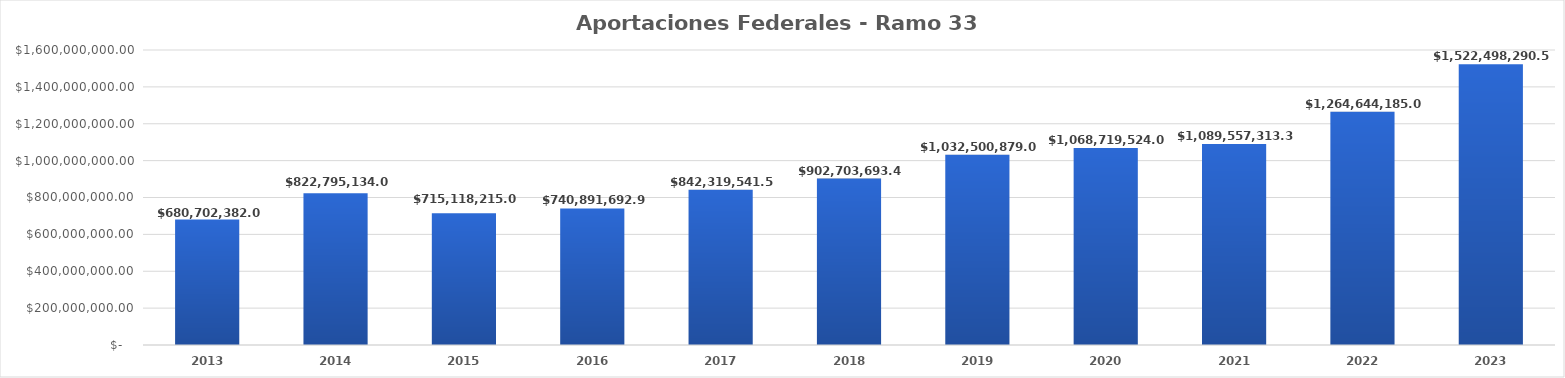
| Category | Aportaciones Federales - Ramo 33 FISM-FORTAMUN |
|---|---|
| 2013.0 | 680702382 |
| 2014.0 | 822795134 |
| 2015.0 | 715118215 |
| 2016.0 | 740891692.9 |
| 2017.0 | 842319541.5 |
| 2018.0 | 902703693.48 |
| 2019.0 | 1032500879 |
| 2020.0 | 1068719524 |
| 2021.0 | 1089557313.39 |
| 2022.0 | 1264644185.09 |
| 2023.0 | 1522498290.59 |